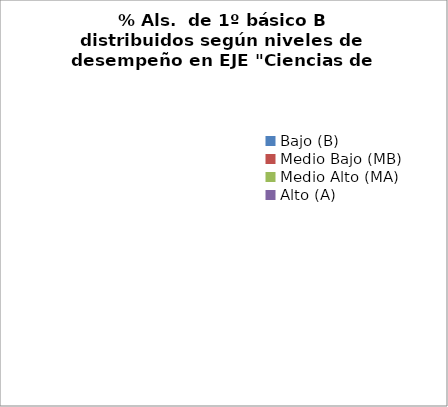
| Category | Series 0 |
|---|---|
| Bajo (B) | 0 |
| Medio Bajo (MB) | 0 |
| Medio Alto (MA) | 0 |
| Alto (A) | 0 |